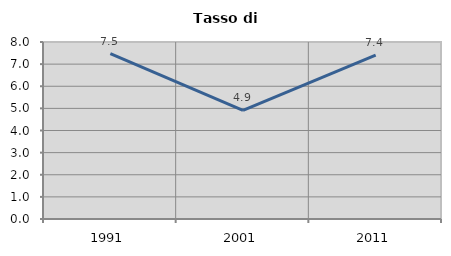
| Category | Tasso di disoccupazione   |
|---|---|
| 1991.0 | 7.479 |
| 2001.0 | 4.913 |
| 2011.0 | 7.41 |